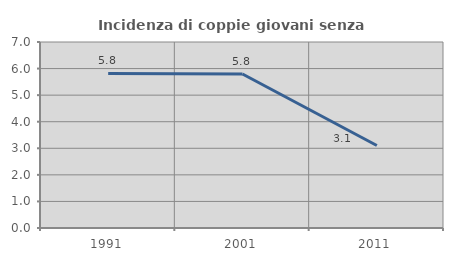
| Category | Incidenza di coppie giovani senza figli |
|---|---|
| 1991.0 | 5.819 |
| 2001.0 | 5.797 |
| 2011.0 | 3.106 |